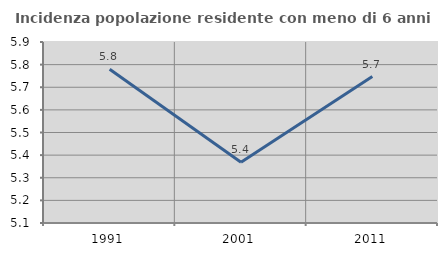
| Category | Incidenza popolazione residente con meno di 6 anni |
|---|---|
| 1991.0 | 5.78 |
| 2001.0 | 5.369 |
| 2011.0 | 5.747 |